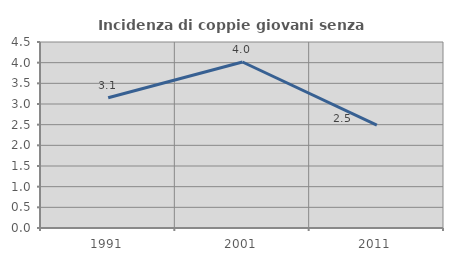
| Category | Incidenza di coppie giovani senza figli |
|---|---|
| 1991.0 | 3.15 |
| 2001.0 | 4.016 |
| 2011.0 | 2.49 |